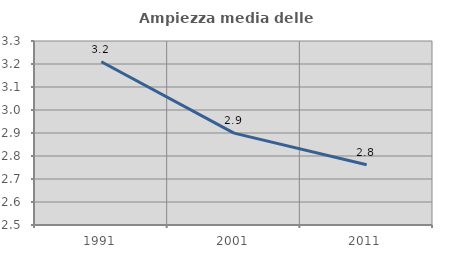
| Category | Ampiezza media delle famiglie |
|---|---|
| 1991.0 | 3.21 |
| 2001.0 | 2.899 |
| 2011.0 | 2.762 |